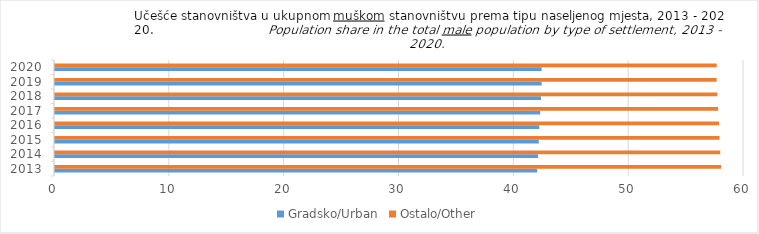
| Category | Gradsko/Urban | Ostalo/Other |
|---|---|---|
| 0 | 41.989 | 58.011 |
| 1 | 42.07 | 57.93 |
| 2 | 42.128 | 57.872 |
| 3 | 42.176 | 57.824 |
| 4 | 42.255 | 57.745 |
| 5 | 42.328 | 57.672 |
| 6 | 42.38 | 57.62 |
| 7 | 42.378 | 57.622 |